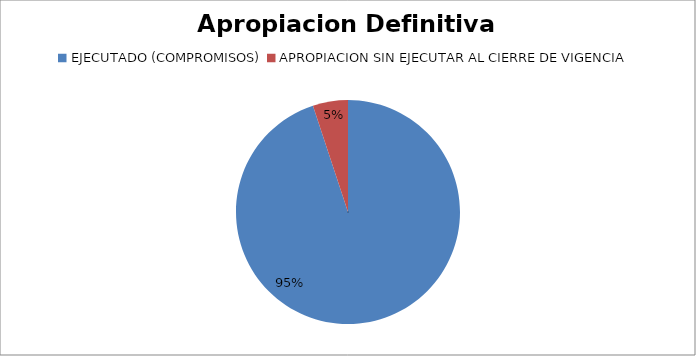
| Category | EJECUCION 2015 |
|---|---|
| EJECUTADO (COMPROMISOS) | 465905407056.41 |
| APROPIACION SIN EJECUTAR AL CIERRE DE VIGENCIA | 24875503477.59 |